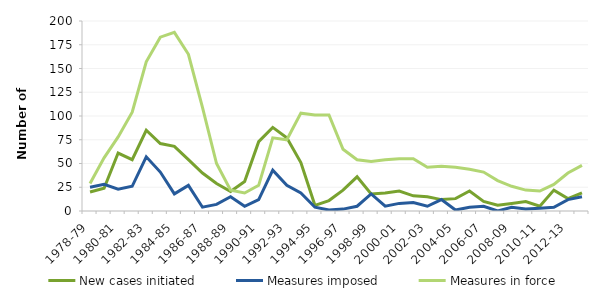
| Category | New cases initiated | Measures imposed | Measures in force |
|---|---|---|---|
| 1978-79 | 20 | 25 | 29 |
| 1979-80 | 24 | 28 | 56 |
| 1980-81 | 61 | 23 | 78 |
| 1981-82 | 54 | 26 | 104 |
| 1982-83 | 85 | 57 | 157 |
| 1983-84 | 71 | 41 | 183 |
| 1984-85 | 68 | 18 | 188 |
| 1985-86 | 54 | 27 | 165 |
| 1986-87 | 40 | 4 | 109 |
| 1987-88 | 29 | 7 | 50 |
| 1988-89 | 20.5 | 15 | 22 |
| 1989-90 | 31 | 5 | 19 |
| 1990-91 | 73 | 12 | 27 |
| 1991-92 | 88 | 43 | 77 |
| 1992-93 | 77 | 27 | 75 |
| 1993-94 | 51 | 19 | 103 |
| 1994-95 | 6 | 4 | 101 |
| 1995-96 | 11 | 1 | 101 |
| 1996-97 | 22 | 2 | 65 |
| 1997-98 | 36 | 5 | 54 |
| 1998-99 | 18 | 18 | 52 |
| 1999-00 | 19 | 5 | 54 |
| 2000-01 | 21 | 8 | 55 |
| 2001-02 | 16 | 9 | 55 |
| 2002-03 | 15 | 5 | 46 |
| 2003-04 | 12 | 12 | 47 |
| 2004-05 | 13 | 1 | 46 |
| 2005-06 | 21 | 4 | 44 |
| 2006-07 | 10 | 5 | 41 |
| 2007-08 | 6 | 0 | 32 |
| 2008-09 | 8 | 4 | 26 |
| 2009-10 | 10 | 2 | 22 |
| 2010-11 | 5 | 3 | 21 |
| 2011-12 | 22 | 4 | 28 |
| 2012-13 | 13 | 12 | 40 |
| 2013-14 | 19 | 15 | 48 |